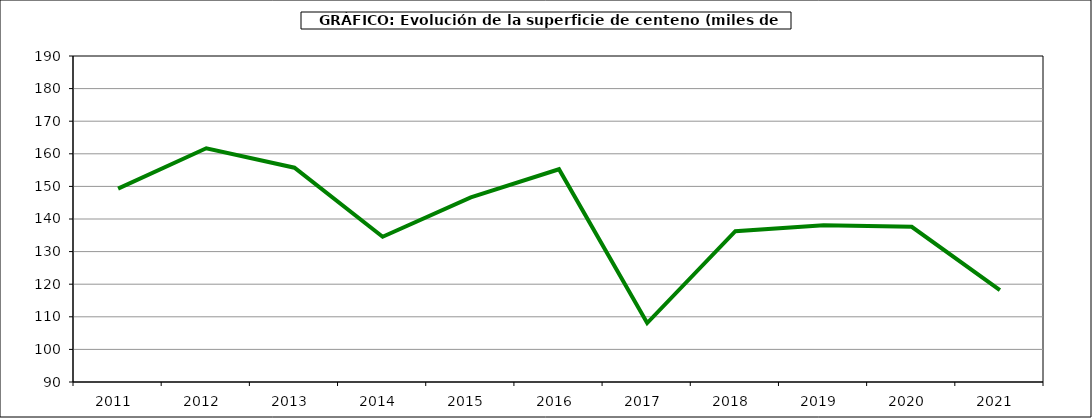
| Category | Superficie |
|---|---|
| 2011.0 | 149.321 |
| 2012.0 | 161.702 |
| 2013.0 | 155.734 |
| 2014.0 | 134.563 |
| 2015.0 | 146.625 |
| 2016.0 | 155.256 |
| 2017.0 | 108.08 |
| 2018.0 | 136.251 |
| 2019.0 | 138.093 |
| 2020.0 | 137.59 |
| 2021.0 | 118.201 |